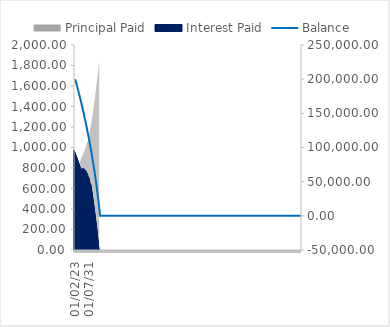
| Category | Principal Paid | Interest Paid |
|---|---|---|
| 01/02/23 | 697.078 | 973.51 |
| 01/03/23 | 700.471 | 970.117 |
| 01/04/23 | 703.881 | 966.707 |
| 01/05/23 | 707.307 | 963.281 |
| 01/06/23 | 710.75 | 959.838 |
| 01/07/23 | 714.209 | 956.379 |
| 01/08/23 | 717.686 | 952.902 |
| 01/09/23 | 721.179 | 949.409 |
| 01/10/23 | 724.69 | 945.899 |
| 01/11/23 | 728.217 | 942.371 |
| 01/12/23 | 731.762 | 938.827 |
| 01/01/24 | 735.324 | 935.265 |
| 01/02/24 | 738.903 | 931.685 |
| 01/03/24 | 742.499 | 928.089 |
| 01/04/24 | 746.114 | 924.475 |
| 01/05/24 | 749.745 | 920.843 |
| 01/06/24 | 753.395 | 917.193 |
| 01/07/24 | 757.062 | 913.526 |
| 01/08/24 | 760.747 | 909.841 |
| 01/09/24 | 764.45 | 906.138 |
| 01/10/24 | 768.171 | 902.417 |
| 01/11/24 | 771.91 | 898.678 |
| 01/12/24 | 775.667 | 894.921 |
| 01/01/25 | 779.443 | 891.145 |
| 01/02/25 | 783.237 | 887.351 |
| 01/03/25 | 787.049 | 883.539 |
| 01/04/25 | 790.88 | 879.708 |
| 01/05/25 | 794.73 | 875.858 |
| 01/06/25 | 798.598 | 871.99 |
| 01/07/25 | 802.486 | 868.103 |
| 01/08/25 | 806.392 | 864.196 |
| 01/09/25 | 810.317 | 860.271 |
| 01/10/25 | 814.261 | 856.327 |
| 01/11/25 | 818.225 | 852.364 |
| 01/12/25 | 822.207 | 848.381 |
| 01/01/26 | 826.21 | 844.379 |
| 01/02/26 | 830.231 | 840.357 |
| 01/03/26 | 834.272 | 836.316 |
| 01/04/26 | 838.333 | 832.255 |
| 01/05/26 | 842.414 | 828.174 |
| 01/06/26 | 846.514 | 824.074 |
| 01/07/26 | 850.635 | 819.953 |
| 01/08/26 | 854.775 | 815.813 |
| 01/09/26 | 858.936 | 811.652 |
| 01/10/26 | 863.117 | 807.471 |
| 01/11/26 | 867.318 | 803.27 |
| 01/12/26 | 871.54 | 799.048 |
| 01/01/27 | 875.782 | 794.806 |
| 01/02/27 | 880.045 | 790.543 |
| 01/03/27 | 884.329 | 786.26 |
| 01/04/27 | 888.633 | 781.955 |
| 01/05/27 | 892.959 | 777.63 |
| 01/06/27 | 897.305 | 773.283 |
| 01/07/27 | 901.673 | 768.915 |
| 01/08/27 | 906.062 | 764.526 |
| 01/09/27 | 910.472 | 760.116 |
| 01/10/27 | 914.904 | 755.684 |
| 01/11/27 | 919.357 | 751.231 |
| 01/12/27 | 923.832 | 746.756 |
| 01/01/28 | 928.329 | 742.259 |
| 01/02/28 | 909.183 | 797.478 |
| 01/03/28 | 913.966 | 792.694 |
| 01/04/28 | 918.775 | 787.885 |
| 01/05/28 | 923.61 | 783.051 |
| 01/06/28 | 928.469 | 778.191 |
| 01/07/28 | 933.355 | 773.306 |
| 01/08/28 | 938.266 | 768.395 |
| 01/09/28 | 943.203 | 763.458 |
| 01/10/28 | 948.166 | 758.495 |
| 01/11/28 | 953.154 | 753.506 |
| 01/12/28 | 958.17 | 748.491 |
| 01/01/29 | 963.211 | 743.449 |
| 01/02/29 | 946.324 | 793.454 |
| 01/03/29 | 951.675 | 788.104 |
| 01/04/29 | 957.056 | 782.723 |
| 01/05/29 | 962.467 | 777.312 |
| 01/06/29 | 967.909 | 771.87 |
| 01/07/29 | 973.382 | 766.397 |
| 01/08/29 | 978.886 | 760.893 |
| 01/09/29 | 984.42 | 755.359 |
| 01/10/29 | 989.986 | 749.792 |
| 01/11/29 | 995.584 | 744.195 |
| 01/12/29 | 1001.213 | 738.566 |
| 01/01/30 | 1006.874 | 732.905 |
| 01/02/30 | 992.334 | 777.471 |
| 01/03/30 | 998.332 | 771.473 |
| 01/04/30 | 1004.367 | 765.438 |
| 01/05/30 | 1010.438 | 759.367 |
| 01/06/30 | 1016.546 | 753.259 |
| 01/07/30 | 1022.691 | 747.114 |
| 01/08/30 | 1028.873 | 740.932 |
| 01/09/30 | 1035.093 | 734.712 |
| 01/10/30 | 1041.35 | 728.455 |
| 01/11/30 | 1047.645 | 722.16 |
| 01/12/30 | 1053.978 | 715.827 |
| 01/01/31 | 1060.349 | 709.456 |
| 01/02/31 | 1048.299 | 748.301 |
| 01/03/31 | 1055.044 | 741.557 |
| 01/04/31 | 1061.832 | 734.768 |
| 01/05/31 | 1068.664 | 727.937 |
| 01/06/31 | 1075.54 | 721.061 |
| 01/07/31 | 1082.46 | 714.141 |
| 01/08/31 | 1089.424 | 707.176 |
| 01/09/31 | 1096.434 | 700.167 |
| 01/10/31 | 1103.488 | 693.112 |
| 01/11/31 | 1110.588 | 686.012 |
| 01/12/31 | 1117.734 | 678.867 |
| 01/01/32 | 1124.925 | 671.675 |
| 01/02/32 | 1115.577 | 704.45 |
| 01/03/32 | 1123.187 | 696.841 |
| 01/04/32 | 1130.848 | 689.179 |
| 01/05/32 | 1138.563 | 681.465 |
| 01/06/32 | 1146.329 | 673.698 |
| 01/07/32 | 1154.149 | 665.878 |
| 01/08/32 | 1162.022 | 658.005 |
| 01/09/32 | 1169.949 | 650.079 |
| 01/10/32 | 1177.929 | 642.098 |
| 01/11/32 | 1185.965 | 634.063 |
| 01/12/32 | 1194.055 | 625.972 |
| 01/01/33 | 1202.2 | 617.827 |
| 01/02/33 | 1195.839 | 644.107 |
| 01/03/33 | 1204.458 | 635.489 |
| 01/04/33 | 1213.139 | 626.808 |
| 01/05/33 | 1221.882 | 618.064 |
| 01/06/33 | 1230.689 | 609.258 |
| 01/07/33 | 1239.559 | 600.388 |
| 01/08/33 | 1248.492 | 591.454 |
| 01/09/33 | 1257.491 | 582.456 |
| 01/10/33 | 1266.554 | 573.392 |
| 01/11/33 | 1275.682 | 564.264 |
| 01/12/33 | 1284.877 | 555.07 |
| 01/01/34 | 1294.137 | 545.809 |
| 01/02/34 | 1303.464 | 536.482 |
| 01/03/34 | 1312.859 | 527.088 |
| 01/04/34 | 1322.321 | 517.625 |
| 01/05/34 | 1331.852 | 508.095 |
| 01/06/34 | 1341.451 | 498.496 |
| 01/07/34 | 1351.119 | 488.828 |
| 01/08/34 | 1360.857 | 479.09 |
| 01/09/34 | 1370.665 | 469.281 |
| 01/10/34 | 1380.544 | 459.403 |
| 01/11/34 | 1390.494 | 449.453 |
| 01/12/34 | 1400.516 | 439.431 |
| 01/01/35 | 1410.61 | 429.337 |
| 01/02/35 | 1420.776 | 419.17 |
| 01/03/35 | 1431.016 | 408.93 |
| 01/04/35 | 1441.33 | 398.616 |
| 01/05/35 | 1451.718 | 388.228 |
| 01/06/35 | 1462.181 | 377.765 |
| 01/07/35 | 1472.72 | 367.227 |
| 01/08/35 | 1483.334 | 356.612 |
| 01/09/35 | 1494.025 | 345.922 |
| 01/10/35 | 1504.793 | 335.154 |
| 01/11/35 | 1515.638 | 324.308 |
| 01/12/35 | 1526.562 | 313.384 |
| 01/01/36 | 1537.564 | 302.382 |
| 01/02/36 | 1548.646 | 291.3 |
| 01/03/36 | 1559.808 | 280.139 |
| 01/04/36 | 1571.05 | 268.897 |
| 01/05/36 | 1582.373 | 257.574 |
| 01/06/36 | 1593.777 | 246.169 |
| 01/07/36 | 1605.264 | 234.682 |
| 01/08/36 | 1616.834 | 223.112 |
| 01/09/36 | 1628.487 | 211.459 |
| 01/10/36 | 1640.224 | 199.722 |
| 01/11/36 | 1652.046 | 187.901 |
| 01/12/36 | 1663.953 | 175.994 |
| 01/01/37 | 1675.945 | 164.001 |
| 01/02/37 | 1688.024 | 151.922 |
| 01/03/37 | 1700.19 | 139.756 |
| 01/04/37 | 1712.444 | 127.502 |
| 01/05/37 | 1724.786 | 115.16 |
| 01/06/37 | 1737.217 | 102.729 |
| 01/07/37 | 1749.738 | 90.208 |
| 01/08/37 | 1762.349 | 77.597 |
| 01/09/37 | 1775.051 | 64.896 |
| 01/10/37 | 1787.844 | 52.102 |
| 01/11/37 | 1800.73 | 39.217 |
| 01/12/37 | 1813.708 | 26.238 |
| 01/01/38 | 1826.78 | 13.166 |